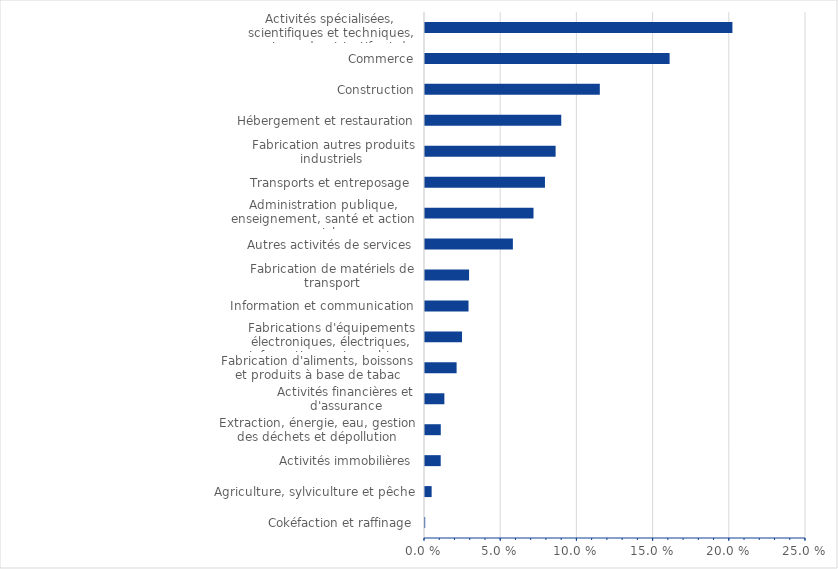
| Category | Series 0 |
|---|---|
| Cokéfaction et raffinage | 0 |
| Agriculture, sylviculture et pêche | 0.004 |
| Activités immobilières | 0.01 |
| Extraction, énergie, eau, gestion des déchets et dépollution | 0.01 |
| Activités financières et d'assurance | 0.013 |
| Fabrication d'aliments, boissons et produits à base de tabac | 0.021 |
| Fabrications d'équipements électroniques, électriques, informatiques et machines  | 0.024 |
| Information et communication | 0.029 |
| Fabrication de matériels de transport | 0.029 |
| Autres activités de services | 0.058 |
| Administration publique, enseignement, santé et action sociale | 0.071 |
| Transports et entreposage  | 0.079 |
| Fabrication autres produits industriels  | 0.086 |
| Hébergement et restauration | 0.089 |
| Construction | 0.115 |
| Commerce | 0.161 |
| Activités spécialisées, scientifiques et techniques, services admnistratifs et de soutien | 0.202 |